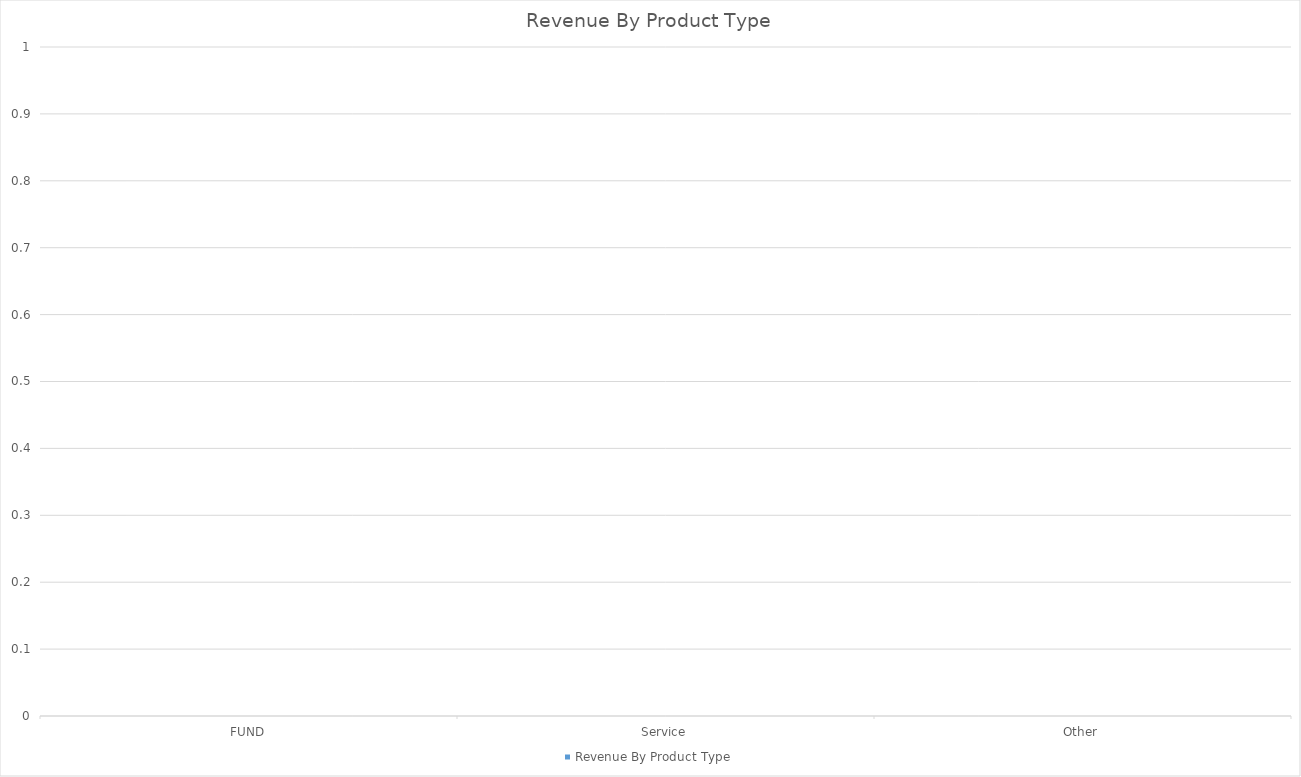
| Category | Revenue By Product Type |
|---|---|
| FUND | 0 |
| Service | 0 |
| Other | 0 |